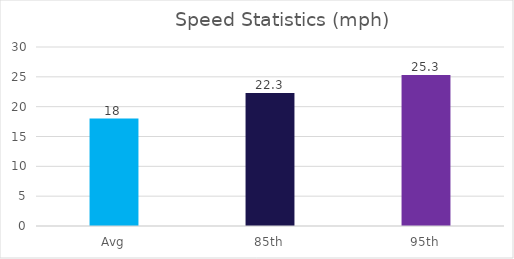
| Category | Series 0 |
|---|---|
| Avg | 18 |
| 85th | 22.3 |
| 95th | 25.3 |